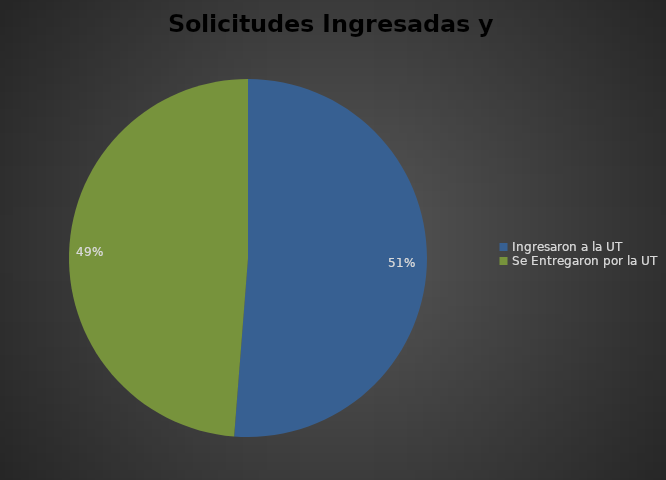
| Category | Series 0 |
|---|---|
| Ingresaron a la UT | 249 |
| Se Entregaron por la UT | 237 |